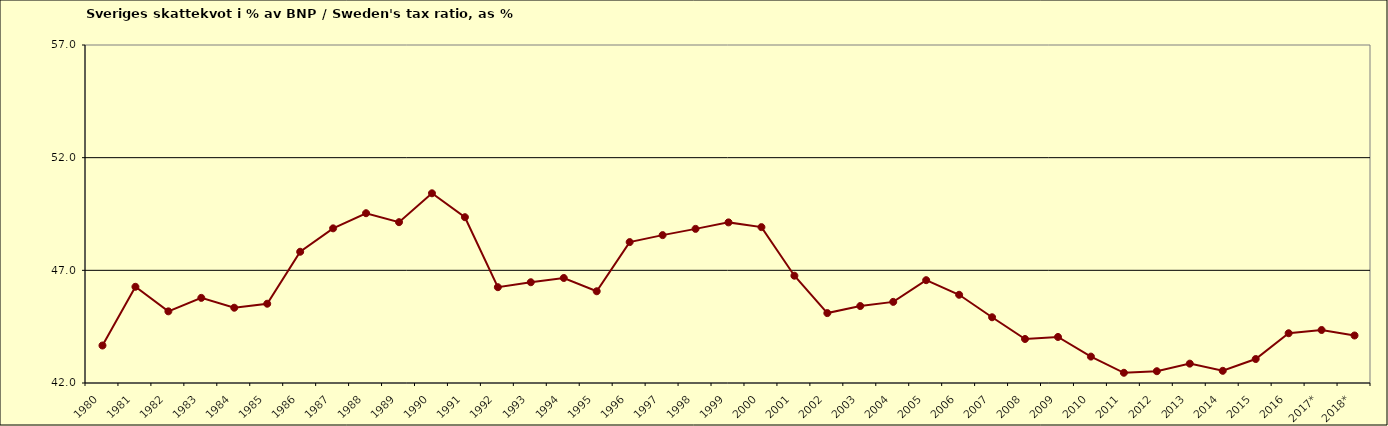
| Category | Series 0 |
|---|---|
| 1980 | 43.664 |
| 1981 | 46.269 |
| 1982 | 45.181 |
| 1983 | 45.778 |
| 1984 | 45.34 |
| 1985 | 45.518 |
| 1986 | 47.824 |
| 1987 | 48.863 |
| 1988 | 49.535 |
| 1989 | 49.137 |
| 1990 | 50.419 |
| 1991 | 49.358 |
| 1992 | 46.251 |
| 1993 | 46.471 |
| 1994 | 46.661 |
| 1995 | 46.071 |
| 1996 | 48.254 |
| 1997 | 48.563 |
| 1998 | 48.84 |
| 1999 | 49.128 |
| 2000 | 48.917 |
| 2001 | 46.761 |
| 2002 | 45.102 |
| 2003 | 45.415 |
| 2004 | 45.6 |
| 2005 | 46.563 |
| 2006 | 45.915 |
| 2007 | 44.917 |
| 2008 | 43.954 |
| 2009 | 44.044 |
| 2010 | 43.172 |
| 2011 | 42.454 |
| 2012 | 42.523 |
| 2013 | 42.859 |
| 2014 | 42.541 |
| 2015 | 43.064 |
| 2016 | 44.208 |
| 2017* | 44.352 |
| 2018* | 44.109 |